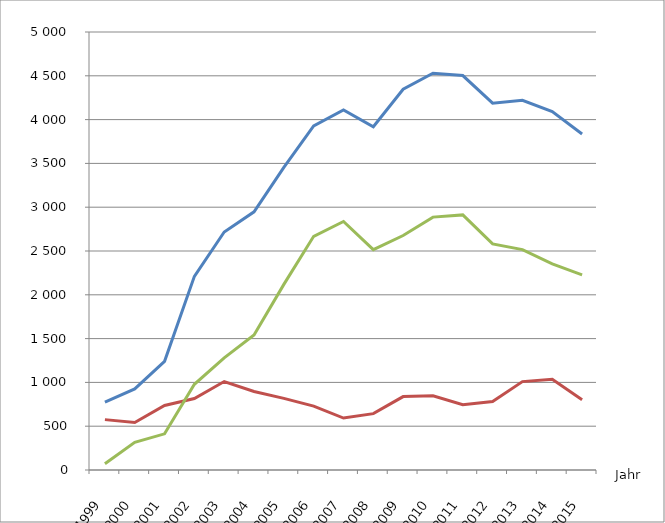
| Category | Verfahren
Insgesamt | von 
Unternehmen1 | von 
Verbrauchern |
|---|---|---|---|
| 1999.0 | 775 | 575 | 71 |
| 2000.0 | 926 | 543 | 316 |
| 2001.0 | 1241 | 737 | 413 |
| 2002.0 | 2211 | 816 | 978 |
| 2003.0 | 2717 | 1010 | 1281 |
| 2004.0 | 2947 | 896 | 1542 |
| 2005.0 | 3455 | 818 | 2119 |
| 2006.0 | 3929 | 729 | 2668 |
| 2007.0 | 4110 | 593 | 2837 |
| 2008.0 | 3919 | 643 | 2516 |
| 2009.0 | 4346 | 838 | 2677 |
| 2010.0 | 4530 | 847 | 2887 |
| 2011.0 | 4503 | 745 | 2912 |
| 2012.0 | 4188 | 781 | 2581 |
| 2013.0 | 4220 | 1009 | 2516 |
| 2014.0 | 4091 | 1035 | 2352 |
| 2015.0 | 3835 | 802 | 2228 |